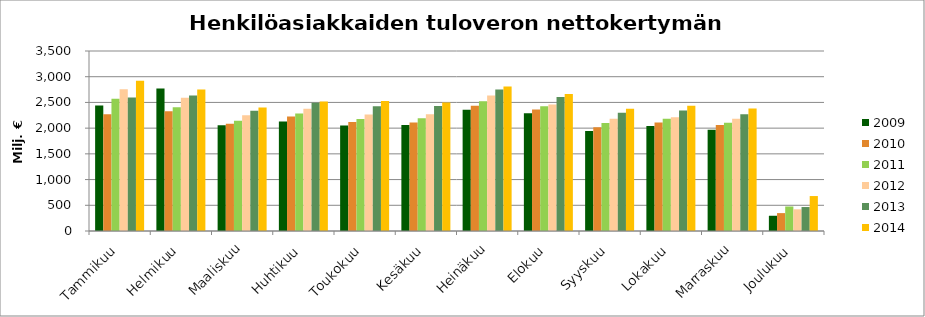
| Category | 2009 | 2010 | 2011 | 2012 | 2013 | 2014 |
|---|---|---|---|---|---|---|
| Tammikuu | 2438.489 | 2267.873 | 2569.442 | 2754.468 | 2597.268 | 2923.115 |
| Helmikuu | 2771.607 | 2330.409 | 2406.04 | 2591.616 | 2636.607 | 2751.009 |
| Maaliskuu | 2054.852 | 2084.249 | 2145.291 | 2250.057 | 2340.316 | 2399.333 |
| Huhtikuu | 2131.066 | 2225.487 | 2285.914 | 2375.631 | 2492.368 | 2520.095 |
| Toukokuu | 2051.558 | 2117.095 | 2177.688 | 2264.689 | 2423.516 | 2528.722 |
| Kesäkuu | 2063.182 | 2109.339 | 2194.481 | 2268.001 | 2432.777 | 2498.654 |
| Heinäkuu | 2357.008 | 2435.026 | 2524.383 | 2633.57 | 2750.145 | 2811.062 |
| Elokuu | 2289.863 | 2364.596 | 2427.052 | 2461.949 | 2607.529 | 2661.459 |
| Syyskuu | 1946.167 | 2019.118 | 2102.001 | 2184.152 | 2299.363 | 2375.832 |
| Lokakuu | 2041.676 | 2107.95 | 2185.045 | 2211.144 | 2342.648 | 2437.263 |
| Marraskuu | 1967.798 | 2063.457 | 2106.752 | 2183.43 | 2270.307 | 2384.008 |
| Joulukuu | 296.354 | 347.927 | 476.484 | 421.857 | 466.039 | 679.673 |